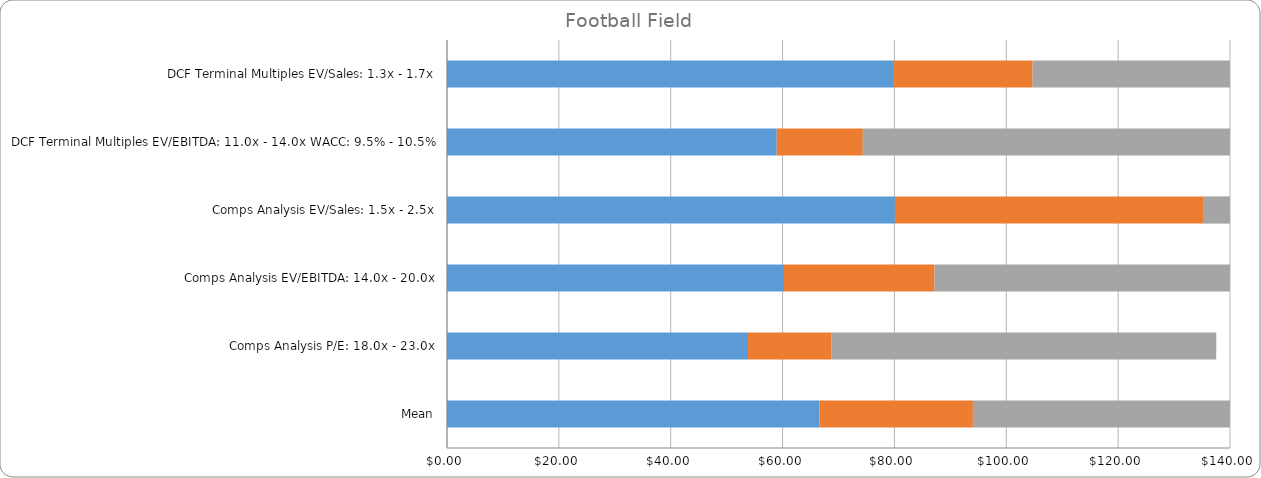
| Category | Series 0 | Series 1 | Series 2 |
|---|---|---|---|
| DCF Terminal Multiples EV/Sales: 1.3x - 1.7x | 79.91 | 24.804 | 104.714 |
| DCF Terminal Multiples EV/EBITDA: 11.0x - 14.0x WACC: 9.5% - 10.5% | 58.957 | 15.387 | 74.344 |
| Comps Analysis EV/Sales: 1.5x - 2.5x | 80.086 | 55.086 | 135.171 |
| Comps Analysis EV/EBITDA: 14.0x - 20.0x | 60.257 | 26.914 | 87.171 |
| Comps Analysis P/E: 18.0x - 23.0x | 53.82 | 14.95 | 68.77 |
| Mean | 66.606 | 27.428 | 94.034 |